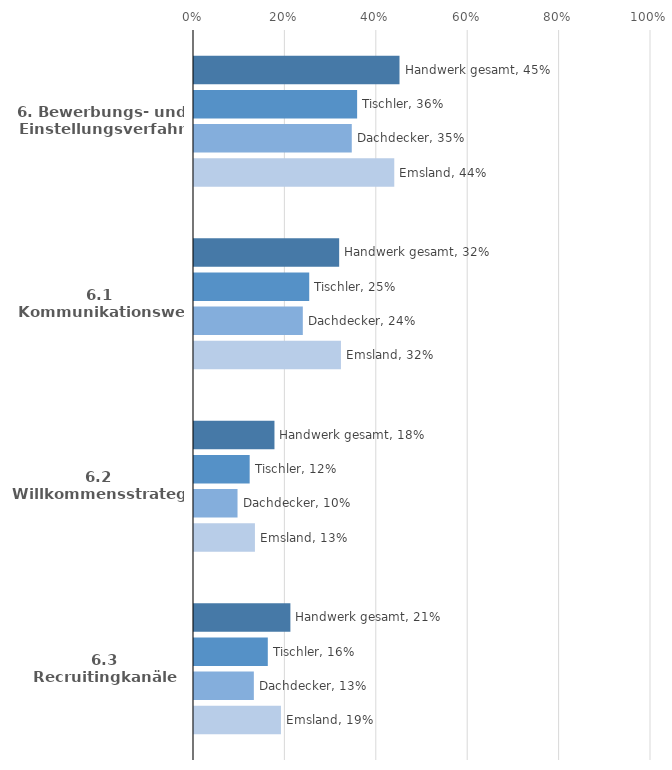
| Category | Handwerk gesamt | Tischler | Dachdecker | Emsland |
|---|---|---|---|---|
| 6. Bewerbungs- und Einstellungsverfahren | 0.45 | 0.357 | 0.345 | 0.438 |
| 6.1 Kommunikationswege | 0.318 | 0.252 | 0.238 | 0.322 |
| 6.2 Willkommensstrategie | 0.176 | 0.122 | 0.095 | 0.133 |
| 6.3 Recruitingkanäle | 0.211 | 0.161 | 0.131 | 0.19 |